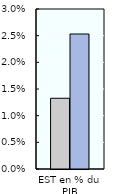
| Category | 2000-02 | 2018-20 |
|---|---|---|
| EST en % du PIB | 0.013 | 0.025 |